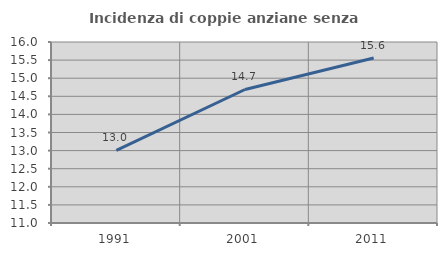
| Category | Incidenza di coppie anziane senza figli  |
|---|---|
| 1991.0 | 13.006 |
| 2001.0 | 14.688 |
| 2011.0 | 15.56 |